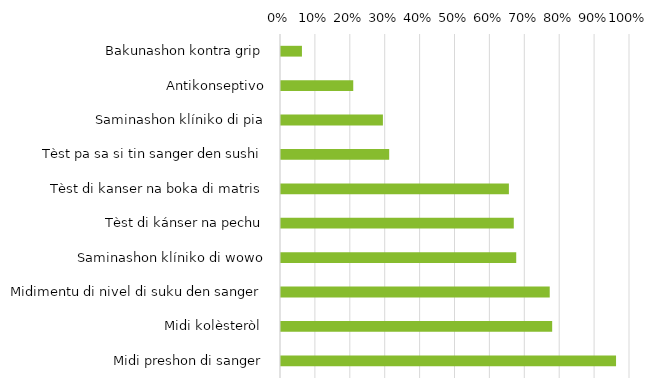
| Category | Series 0 |
|---|---|
| Bakunashon kontra grip | 0.06 |
| Antikonseptivo | 0.207 |
| Saminashon klíniko di pia | 0.292 |
| Tèst pa sa si tin sanger den sushi | 0.31 |
| Tèst di kanser na boka di matris | 0.653 |
| Tèst di kánser na pechu | 0.667 |
| Saminashon klíniko di wowo | 0.674 |
| Midimentu di nivel di suku den sanger | 0.77 |
| Midi kolèsteròl  | 0.777 |
| Midi preshon di sanger | 0.96 |